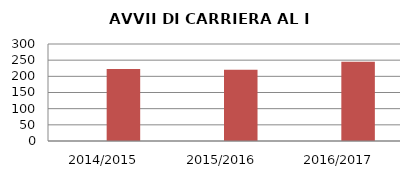
| Category | ANNO | NUMERO |
|---|---|---|
| 2014/2015 | 0 | 223 |
| 2015/2016 | 0 | 220 |
| 2016/2017 | 0 | 245 |